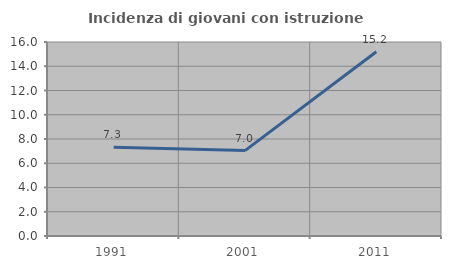
| Category | Incidenza di giovani con istruzione universitaria |
|---|---|
| 1991.0 | 7.317 |
| 2001.0 | 7.042 |
| 2011.0 | 15.196 |